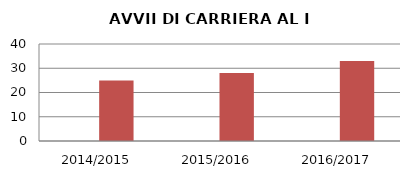
| Category | ANNO | NUMERO |
|---|---|---|
| 2014/2015 | 0 | 25 |
| 2015/2016 | 0 | 28 |
| 2016/2017 | 0 | 33 |